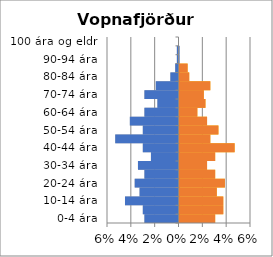
| Category | % karlar | %konur |
|---|---|---|
| 0-4 ára | -0.029 | 0.03 |
| 5-9 ára | -0.03 | 0.037 |
| 10-14 ára | -0.045 | 0.037 |
| 15-19 ára | -0.033 | 0.031 |
| 20-24 ára | -0.037 | 0.038 |
| 25-29 ára | -0.029 | 0.03 |
| 30-34 ára | -0.034 | 0.023 |
| 35-39 ára | -0.023 | 0.03 |
| 40-44 ára | -0.03 | 0.046 |
| 45-49 ára | -0.053 | 0.026 |
| 50-54 ára | -0.03 | 0.033 |
| 55-59 ára | -0.041 | 0.023 |
| 60-64 ára | -0.029 | 0.015 |
| 65-69 ára | -0.018 | 0.022 |
| 70-74 ára | -0.029 | 0.02 |
| 75-79 ára | -0.019 | 0.026 |
| 80-84 ára | -0.007 | 0.008 |
| 85-89 ára | -0.003 | 0.007 |
| 90-94 ára | -0.001 | 0 |
| 95-99 ára | -0.001 | 0 |
| 100 ára og eldri | 0 | 0 |